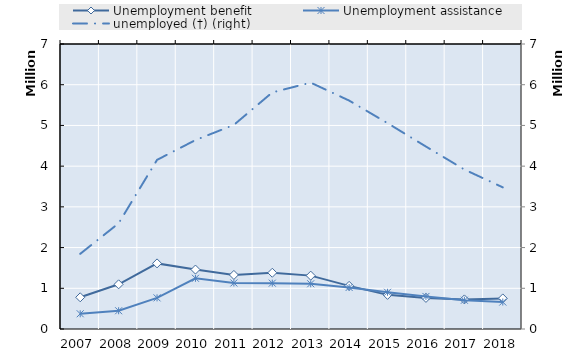
| Category | Survivors' pension from occupational accident insurance | 0 | Series 14 | Series 15 | Series 16 | Series 17 | Series 18 | Series 19 | Unemployment benefit | Unemployment assistance |
|---|---|---|---|---|---|---|---|---|---|---|
| 2007.0 |  |  |  |  |  |  |  |  | 778365 | 373891.25 |
| 2008.0 |  |  |  |  |  |  |  |  | 1097556 | 448441.25 |
| 2009.0 |  |  |  |  |  |  |  |  | 1611522 | 764805.417 |
| 2010.0 |  |  |  |  |  |  |  |  | 1459956 | 1245513.167 |
| 2011.0 |  |  |  |  |  |  |  |  | 1328020 | 1130292 |
| 2012.0 |  |  |  |  |  |  |  |  | 1381261 | 1126010.25 |
| 2013.0 |  |  |  |  |  |  |  |  | 1310914.917 | 1111023.833 |
| 2014.0 |  |  |  |  |  |  |  |  | 1059799.25 | 1020116.833 |
| 2015.0 |  |  |  |  |  |  |  |  | 838392 | 901885 |
| 2016.0 |  |  |  |  |  |  |  |  | 763697 | 799623 |
| 2017.0 |  |  |  |  |  |  |  |  | 726574.583 | 706294.25 |
| 2018.0 |  |  |  |  |  |  |  |  | 751171.667 | 662138.417 |